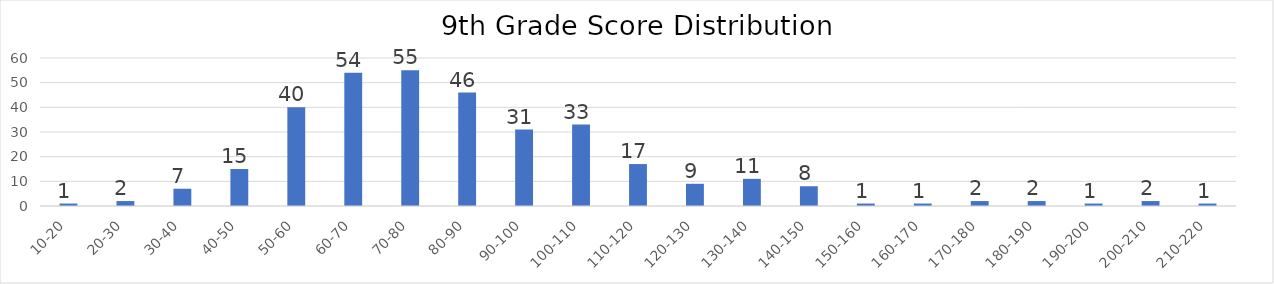
| Category | Series 0 |
|---|---|
| 10-20 | 1 |
| 20-30 | 2 |
| 30-40 | 7 |
| 40-50 | 15 |
| 50-60 | 40 |
| 60-70 | 54 |
| 70-80 | 55 |
| 80-90 | 46 |
| 90-100 | 31 |
| 100-110 | 33 |
| 110-120 | 17 |
| 120-130 | 9 |
| 130-140 | 11 |
| 140-150 | 8 |
| 150-160 | 1 |
| 160-170 | 1 |
| 170-180 | 2 |
| 180-190 | 2 |
| 190-200 | 1 |
| 200-210 | 2 |
| 210-220 | 1 |